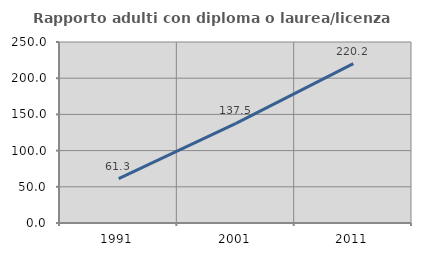
| Category | Rapporto adulti con diploma o laurea/licenza media  |
|---|---|
| 1991.0 | 61.333 |
| 2001.0 | 137.5 |
| 2011.0 | 220.207 |